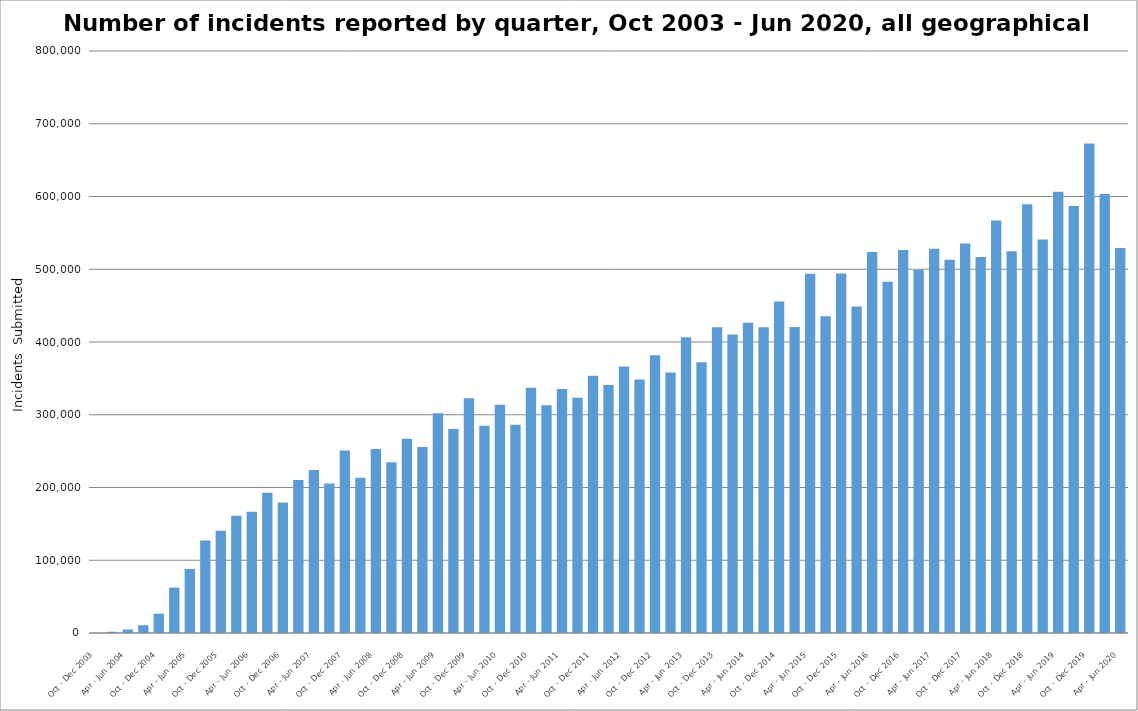
| Category | *All geographical locations |
|---|---|
| Oct - Dec 2003 | 158 |
| Jan - Mar 2004 | 1716 |
| Apr - Jun 2004 | 4823 |
| Jul - Sep 2004 | 10720 |
| Oct - Dec 2004 | 26508 |
| Jan - Mar 2005 | 62351 |
| Apr - Jun 2005 | 88042 |
| Jul - Sep 2005 | 127170 |
| Oct - Dec 2005 | 140394 |
| Jan - Mar 2006 | 161141 |
| Apr - Jun 2006 | 166539 |
| Jul - Sep 2006 | 192794 |
| Oct - Dec 2006 | 179538 |
| Jan - Mar 2007 | 210178 |
| Apr - Jun 2007 | 224047 |
| Jul - Sep 2007 | 205357 |
| Oct - Dec 2007 | 251010 |
| Jan - Mar 2008 | 213281 |
| Apr - Jun 2008 | 253006 |
| Jul - Sep 2008 | 234863 |
| Oct - Dec 2008 | 267135 |
| Jan - Mar 2009 | 255837 |
| Apr - Jun 2009 | 302198 |
| Jul - Sep 2009 | 280454 |
| Oct - Dec 2009 | 322757 |
| Jan - Mar 2010 | 284962 |
| Apr - Jun 2010 | 313827 |
| Jul - Sep 2010 | 286096 |
| Oct - Dec 2010 | 337149 |
| Jan - Mar 2011 | 312982 |
| Apr - Jun 2011 | 335327 |
| Jul - Sep 2011 | 323427 |
| Oct - Dec 2011 | 353578 |
| Jan - Mar 2012 | 340826 |
| Apr - Jun 2012 | 366262 |
| Jul - Sep 2012 | 348341 |
| Oct - Dec 2012 | 381754 |
| Jan - Mar 2013 | 358099 |
| Apr - Jun 2013 | 406617 |
| Jul - Sep 2013 | 372099 |
| Oct - Dec 2013 | 420297 |
| Jan - Mar 2014 | 410408 |
| Apr - Jun 2014 | 426315 |
| Jul - Sep 2014 | 420333 |
| Oct - Dec 2014 | 455584 |
| Jan - Mar 2015 | 420510 |
| Apr - Jun 2015 | 493795 |
| Jul - Sep 2015 | 435245 |
| Oct - Dec 2015 | 494082 |
| Jan - Mar 2016 | 448659 |
| Apr - Jun 2016 | 523610 |
| Jul - Sep 2016 | 482727 |
| Oct - Dec 2016 | 526580 |
| Jan - Mar 2017 | 499023 |
| Apr - Jun 2017 | 528164 |
| Jul - Sep 2017 | 513153 |
| Oct - Dec 2017 | 535229 |
| Jan - Mar 2018 | 516918 |
| Apr - Jun 2018 | 566898 |
| Jul - Sep 2018 | 524805 |
| Oct - Dec 2018 | 589471 |
| Jan - Mar 2019 | 540731 |
| Apr - Jun 2019 | 606613 |
| Jul - Sep 2019 | 586993 |
| Oct - Dec 2019 | 672985 |
| Jan - Mar 2020 | 603508 |
| Apr - Jun 2020 | 529061 |